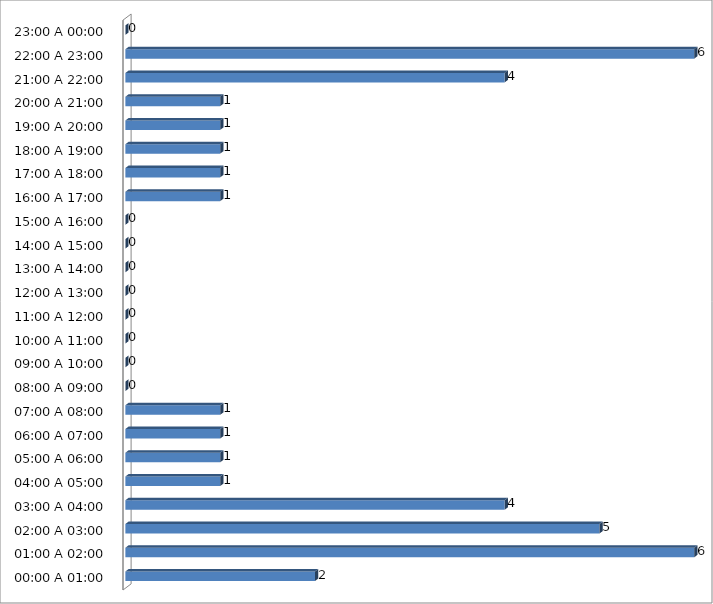
| Category | Series 0 |
|---|---|
| 00:00 A 01:00 | 2 |
| 01:00 A 02:00 | 6 |
| 02:00 A 03:00 | 5 |
| 03:00 A 04:00 | 4 |
| 04:00 A 05:00 | 1 |
| 05:00 A 06:00 | 1 |
| 06:00 A 07:00 | 1 |
| 07:00 A 08:00 | 1 |
| 08:00 A 09:00 | 0 |
| 09:00 A 10:00 | 0 |
| 10:00 A 11:00 | 0 |
| 11:00 A 12:00 | 0 |
| 12:00 A 13:00 | 0 |
| 13:00 A 14:00 | 0 |
| 14:00 A 15:00 | 0 |
| 15:00 A 16:00 | 0 |
| 16:00 A 17:00 | 1 |
| 17:00 A 18:00 | 1 |
| 18:00 A 19:00 | 1 |
| 19:00 A 20:00 | 1 |
| 20:00 A 21:00 | 1 |
| 21:00 A 22:00 | 4 |
| 22:00 A 23:00 | 6 |
| 23:00 A 00:00 | 0 |